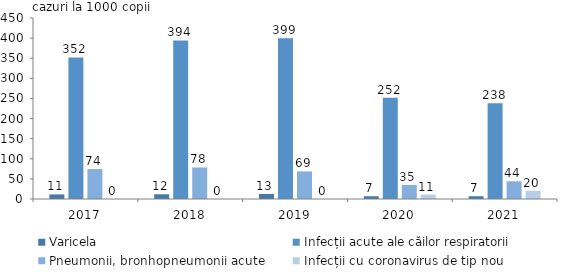
| Category | Varicela | Infecții acute ale căilor respiratorii  | Pneumonii, bronhopneumonii acute | Infecții cu coronavirus de tip nou |
|---|---|---|---|---|
| 2017.0 | 11.381 | 351.98 | 74.37 | 0 |
| 2018.0 | 11.729 | 394.23 | 78.399 | 0 |
| 2019.0 | 12.59 | 399.468 | 68.529 | 0 |
| 2020.0 | 6.836 | 252 | 34.958 | 10.915 |
| 2021.0 | 6.836 | 238 | 44 | 20 |